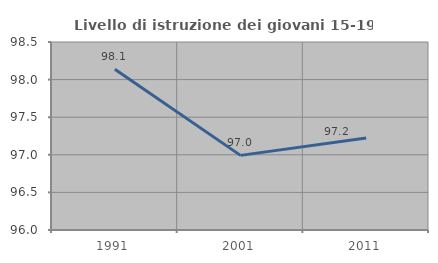
| Category | Livello di istruzione dei giovani 15-19 anni |
|---|---|
| 1991.0 | 98.137 |
| 2001.0 | 96.992 |
| 2011.0 | 97.222 |